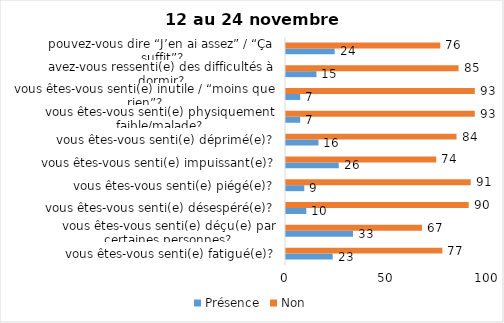
| Category | Présence | Non |
|---|---|---|
| vous êtes-vous senti(e) fatigué(e)? | 23 | 77 |
| vous êtes-vous senti(e) déçu(e) par certaines personnes? | 33 | 67 |
| vous êtes-vous senti(e) désespéré(e)? | 10 | 90 |
| vous êtes-vous senti(e) piégé(e)? | 9 | 91 |
| vous êtes-vous senti(e) impuissant(e)? | 26 | 74 |
| vous êtes-vous senti(e) déprimé(e)? | 16 | 84 |
| vous êtes-vous senti(e) physiquement faible/malade? | 7 | 93 |
| vous êtes-vous senti(e) inutile / “moins que rien”? | 7 | 93 |
| avez-vous ressenti(e) des difficultés à dormir? | 15 | 85 |
| pouvez-vous dire “J’en ai assez” / “Ça suffit”? | 24 | 76 |